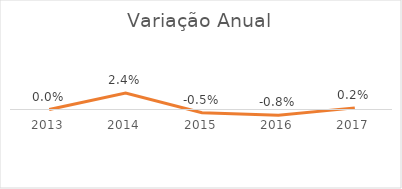
| Category | Series 0 |
|---|---|
| 2013.0 | 0 |
| 2014.0 | 0.024 |
| 2015.0 | -0.005 |
| 2016.0 | -0.008 |
| 2017.0 | 0.002 |